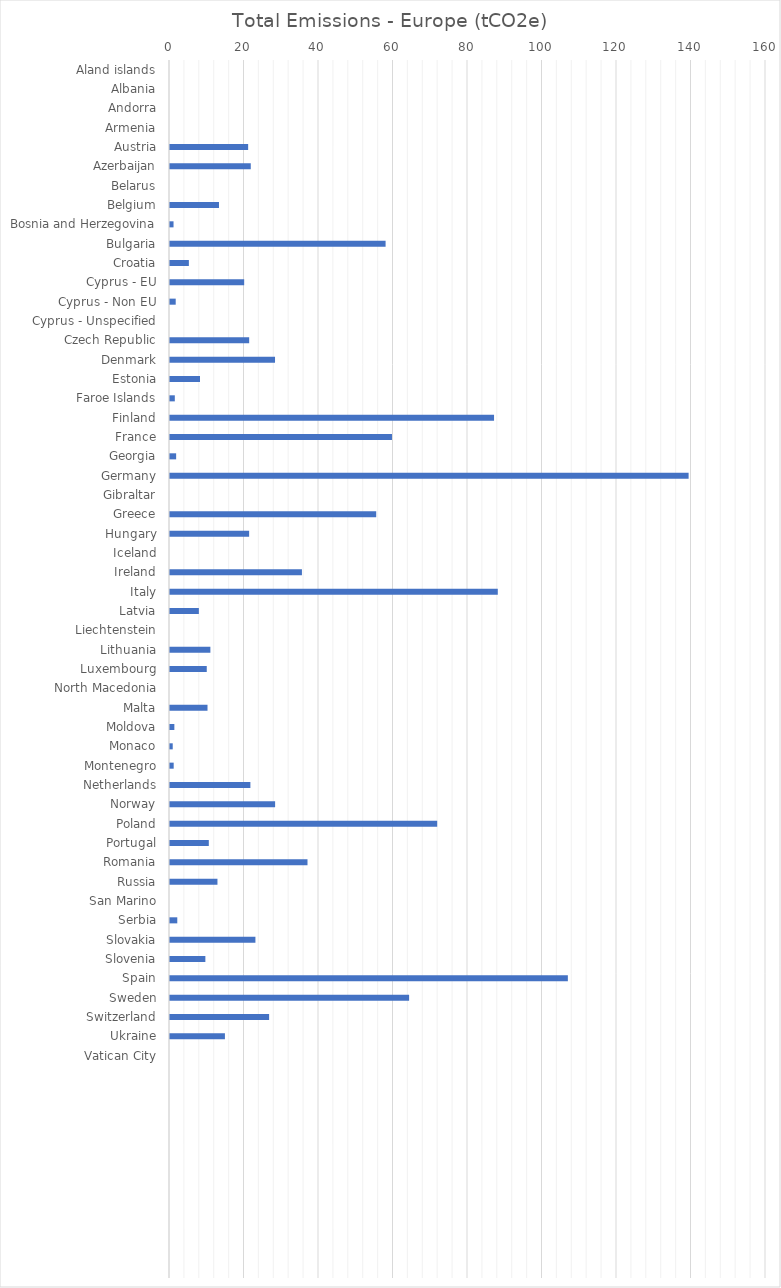
| Category | Total Emissions - Europe (tCO2e) |
|---|---|
| Aland islands | 0 |
| Albania | 0 |
| Andorra | 0 |
| Armenia | 0 |
| Austria | 20.98 |
| Azerbaijan | 21.682 |
| Belarus | 0 |
| Belgium | 13.152 |
| Bosnia and Herzegovina | 0.948 |
| Bulgaria | 57.877 |
| Croatia | 5.066 |
| Cyprus - EU | 19.914 |
| Cyprus - Non EU | 1.532 |
| Cyprus - Unspecified | 0 |
| Czech Republic | 21.255 |
| Denmark | 28.194 |
| Estonia | 8.052 |
| Faroe Islands | 1.293 |
| Finland | 86.992 |
| France | 59.592 |
| Georgia | 1.65 |
| Germany | 139.226 |
| Gibraltar | 0 |
| Greece | 55.359 |
| Hungary | 21.244 |
| Iceland | 0 |
| Ireland | 35.418 |
| Italy | 87.997 |
| Latvia | 7.747 |
| Liechtenstein | 0 |
| Lithuania | 10.839 |
| Luxembourg | 9.869 |
| North Macedonia | 0 |
| Malta | 10.069 |
| Moldova | 1.17 |
| Monaco | 0.732 |
| Montenegro | 0.989 |
| Netherlands | 21.581 |
| Norway | 28.219 |
| Poland | 71.73 |
| Portugal | 10.417 |
| Romania | 36.911 |
| Russia | 12.74 |
| San Marino | 0 |
| Serbia | 1.955 |
| Slovakia | 22.932 |
| Slovenia | 9.494 |
| Spain | 106.808 |
| Sweden | 64.191 |
| Switzerland | 26.609 |
| Ukraine | 14.745 |
| Vatican City | 0 |